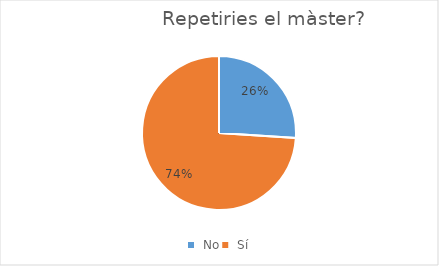
| Category | Series 0 |
|---|---|
|  No | 25 |
|  Sí | 71 |